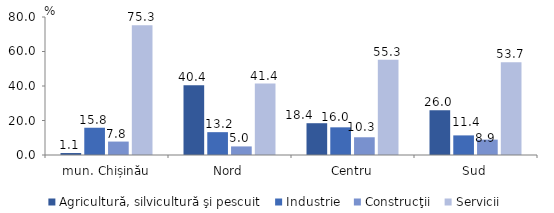
| Category | Agricultură, silvicultură şi pescuit | Industrie | Construcţii | Servicii |
|---|---|---|---|---|
| mun. Chișinău | 1.14 | 15.803 | 7.786 | 75.27 |
| Nord | 40.41 | 13.237 | 4.972 | 41.381 |
| Centru | 18.428 | 16.041 | 10.281 | 55.25 |
| Sud | 25.994 | 11.364 | 8.922 | 53.719 |